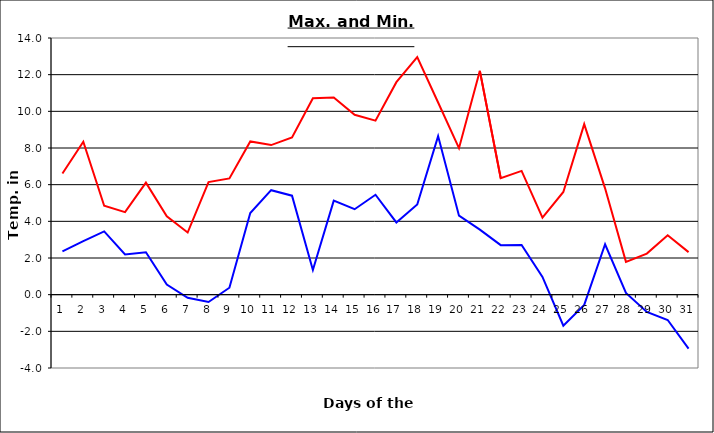
| Category | Series 0 | Series 1 |
|---|---|---|
| 0 | 6.61 | 2.36 |
| 1 | 8.34 | 2.92 |
| 2 | 4.85 | 3.45 |
| 3 | 4.5 | 2.19 |
| 4 | 6.11 | 2.31 |
| 5 | 4.28 | 0.55 |
| 6 | 3.39 | -0.17 |
| 7 | 6.14 | -0.4 |
| 8 | 6.34 | 0.38 |
| 9 | 8.36 | 4.45 |
| 10 | 8.16 | 5.7 |
| 11 | 8.57 | 5.4 |
| 12 | 10.71 | 1.35 |
| 13 | 10.76 | 5.13 |
| 14 | 9.81 | 4.66 |
| 15 | 9.49 | 5.45 |
| 16 | 11.59 | 3.94 |
| 17 | 12.96 | 4.92 |
| 18 | 10.48 | 8.65 |
| 19 | 7.99 | 4.31 |
| 20 | 12.21 | 3.55 |
| 21 | 6.35 | 2.7 |
| 22 | 6.75 | 2.71 |
| 23 | 4.2 | 0.97 |
| 24 | 5.6 | -1.69 |
| 25 | 9.3 | -0.56 |
| 26 | 5.8 | 2.75 |
| 27 | 1.79 | 0.09 |
| 28 | 2.24 | -0.94 |
| 29 | 3.24 | -1.38 |
| 30 | 2.32 | -2.94 |